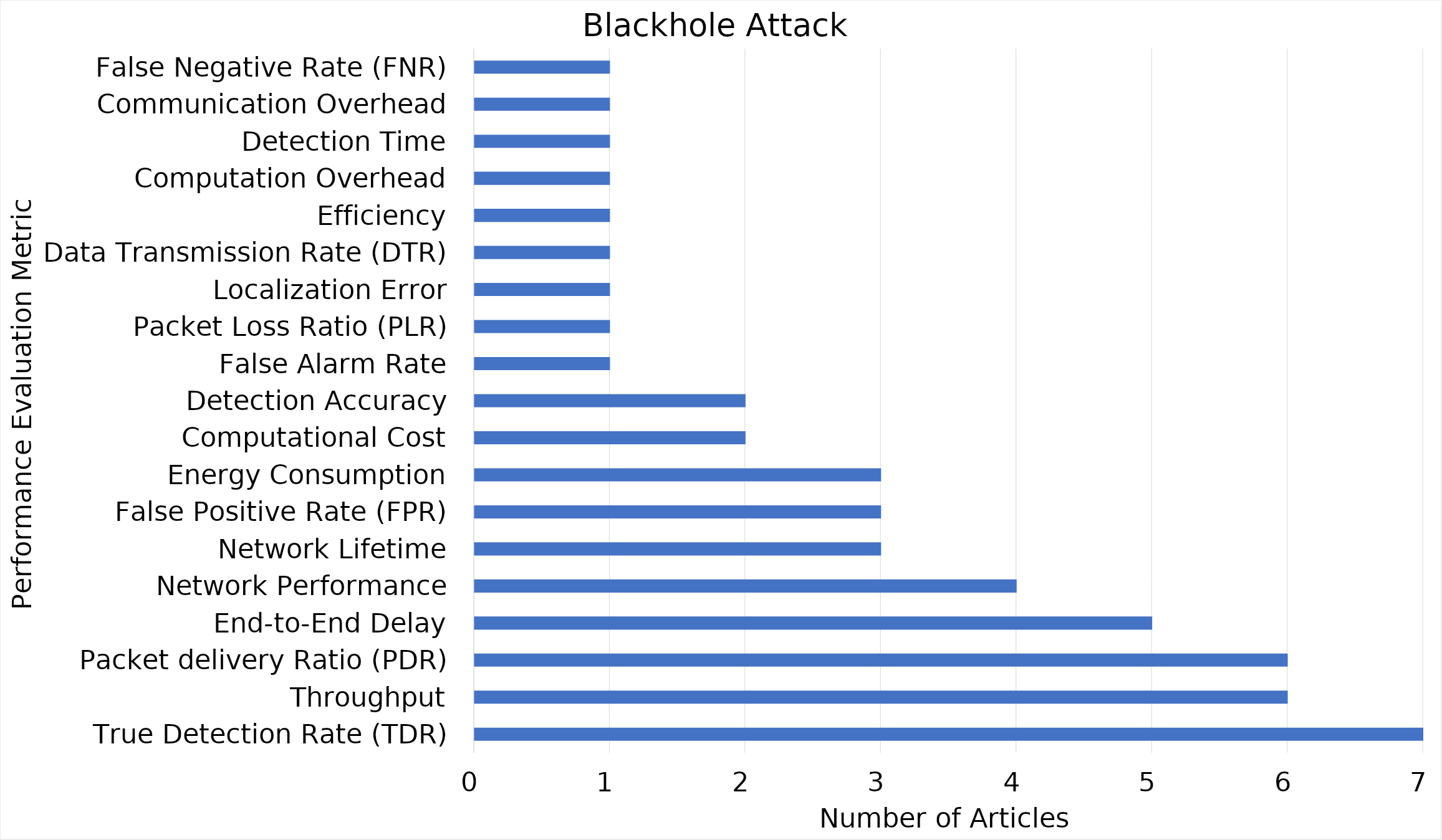
| Category | Blackhole |
|---|---|
| True Detection Rate (TDR) | 7 |
| Throughput | 6 |
| Packet delivery Ratio (PDR) | 6 |
| End-to-End Delay | 5 |
| Network Performance | 4 |
| Network Lifetime | 3 |
| False Positive Rate (FPR) | 3 |
| Energy Consumption | 3 |
| Computational Cost | 2 |
| Detection Accuracy | 2 |
| False Alarm Rate | 1 |
| Packet Loss Ratio (PLR) | 1 |
| Localization Error | 1 |
| Data Transmission Rate (DTR) | 1 |
| Efficiency | 1 |
| Computation Overhead | 1 |
| Detection Time | 1 |
| Communication Overhead | 1 |
| False Negative Rate (FNR) | 1 |